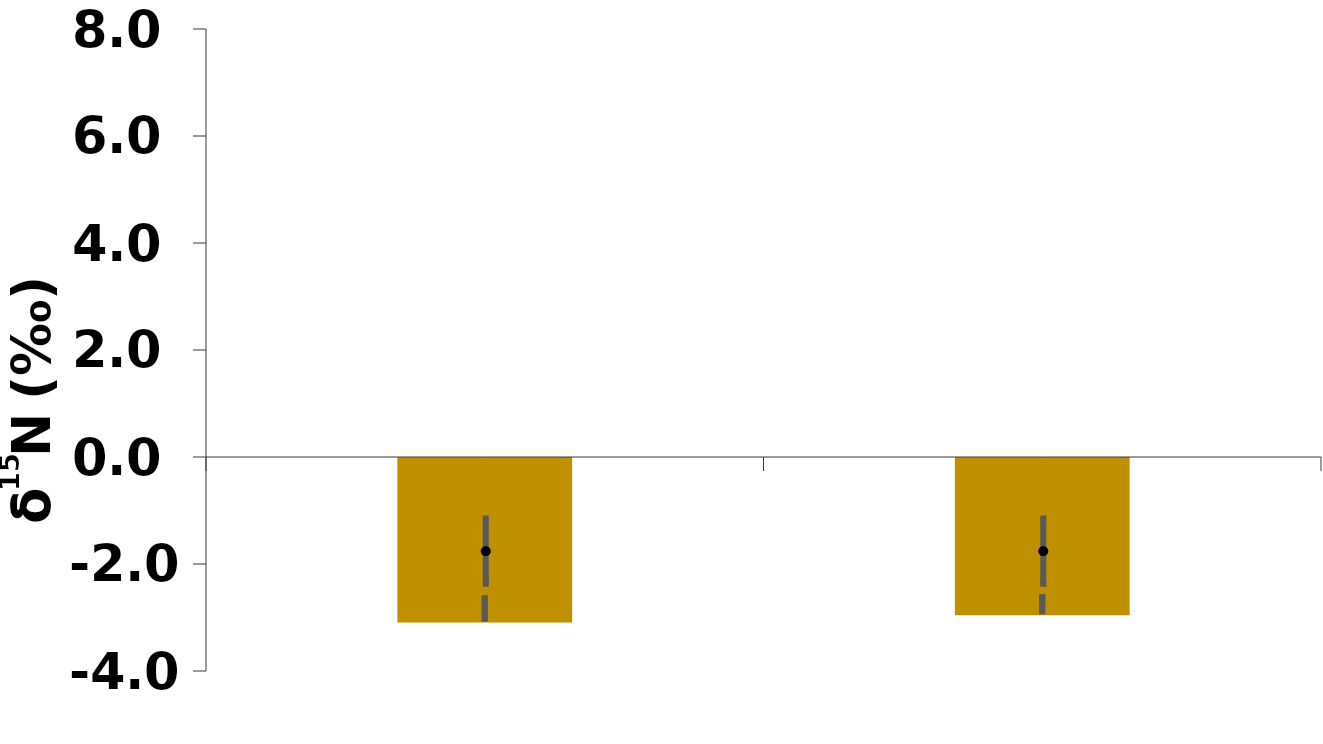
| Category | Whole plant |
|---|---|
| 0.0 | -3.074 |
| 0.0 | -2.939 |